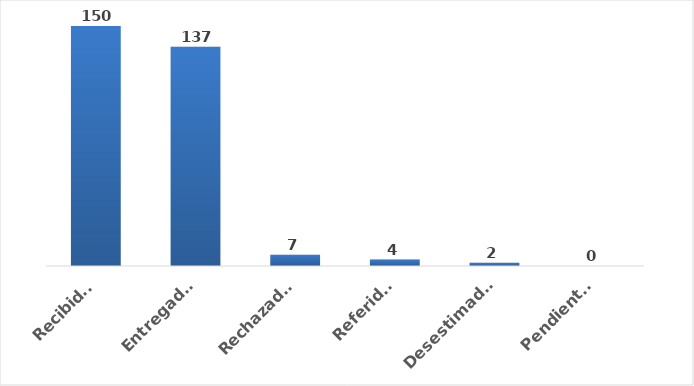
| Category | Series 0 |
|---|---|
| Recibidas | 150 |
| Entregadas | 137 |
| Rechazadas | 7 |
| Referidas | 4 |
| Desestimadas | 2 |
| Pendientes | 0 |